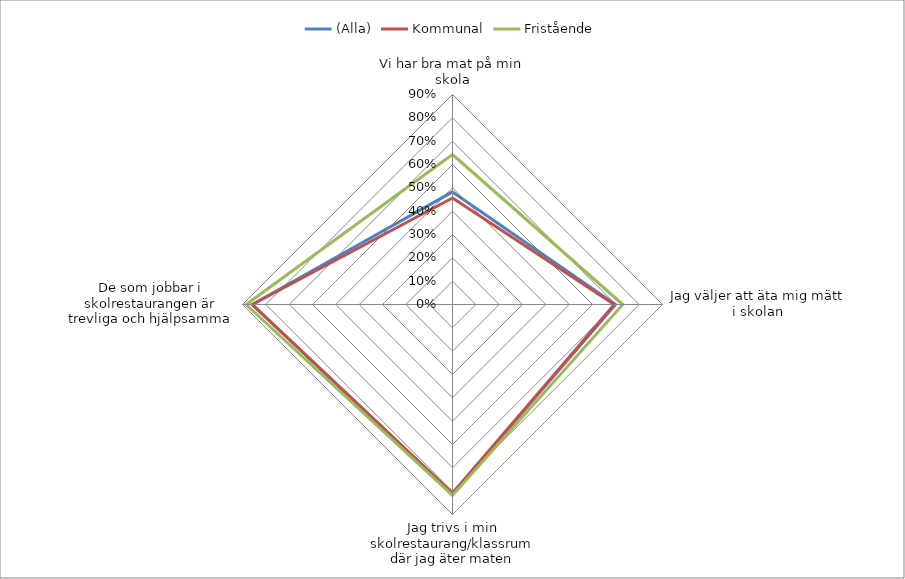
| Category | (Alla) | Kommunal | Fristående |
|---|---|---|---|
| Vi har bra mat på min skola | 0.483 | 0.456 | 0.643 |
| Jag väljer att äta mig mätt i skolan | 0.698 | 0.693 | 0.73 |
| Jag trivs i min skolrestaurang/klassrum där jag äter maten | 0.81 | 0.809 | 0.818 |
| De som jobbar i skolrestaurangen är trevliga och hjälpsamma | 0.858 | 0.858 | 0.885 |